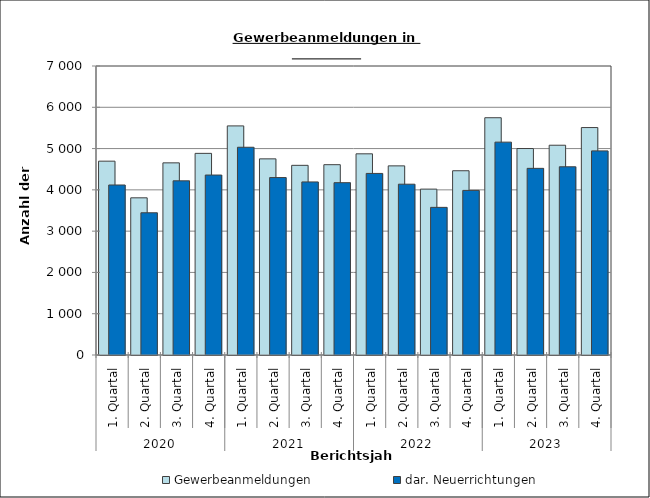
| Category | Gewerbeanmeldungen | dar. Neuerrichtungen |
|---|---|---|
| 0 | 4695 | 4118 |
| 1 | 3807 | 3445 |
| 2 | 4654 | 4219 |
| 3 | 4884 | 4359 |
| 4 | 5549 | 5032 |
| 5 | 4751 | 4298 |
| 6 | 4594 | 4192 |
| 7 | 4610 | 4174 |
| 8 | 4873 | 4398 |
| 9 | 4581 | 4137 |
| 10 | 4018 | 3576 |
| 11 | 4463 | 3987 |
| 12 | 5747 | 5156 |
| 13 | 5001 | 4521 |
| 14 | 5081 | 4559 |
| 15 | 5509 | 4944 |